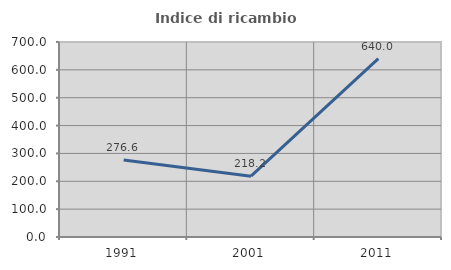
| Category | Indice di ricambio occupazionale  |
|---|---|
| 1991.0 | 276.596 |
| 2001.0 | 218.182 |
| 2011.0 | 640 |